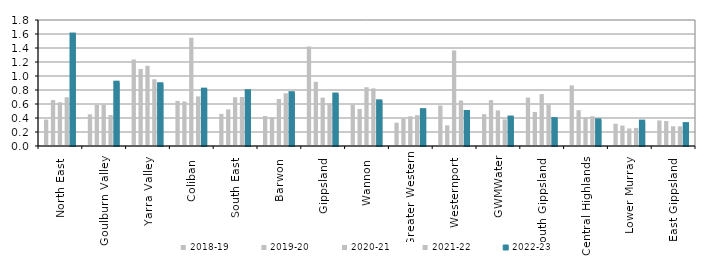
| Category | 2018-19 | 2019-20 | 2020-21 | 2021-22 | 2022-23 |
|---|---|---|---|---|---|
| North East  | 0.377 | 0.656 | 0.625 | 0.697 | 1.592 |
| Goulburn Valley  | 0.452 | 0.586 | 0.592 | 0.443 | 0.905 |
| Yarra Valley  | 1.236 | 1.1 | 1.146 | 0.953 | 0.882 |
| Coliban  | 0.645 | 0.636 | 1.546 | 0.708 | 0.805 |
| South East  | 0.459 | 0.522 | 0.697 | 0.7 | 0.782 |
| Barwon  | 0.428 | 0.414 | 0.671 | 0.754 | 0.755 |
| Gippsland  | 1.422 | 0.917 | 0.691 | 0.607 | 0.735 |
| Wannon  | 0.589 | 0.53 | 0.84 | 0.824 | 0.638 |
| Greater Western | 0.333 | 0.393 | 0.424 | 0.441 | 0.512 |
| Westernport  | 0.578 | 0.296 | 1.365 | 0.65 | 0.485 |
| GWMWater | 0.454 | 0.655 | 0.509 | 0.38 | 0.407 |
| South Gippsland  | 0.691 | 0.487 | 0.741 | 0.596 | 0.385 |
| Central Highlands  | 0.866 | 0.512 | 0.406 | 0.426 | 0.366 |
| Lower Murray  | 0.317 | 0.291 | 0.25 | 0.259 | 0.349 |
| East Gippsland  | 0.365 | 0.356 | 0.282 | 0.281 | 0.313 |